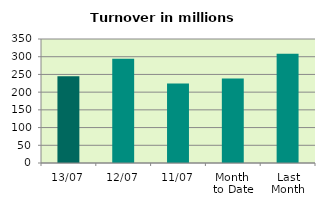
| Category | Series 0 |
|---|---|
| 13/07 | 244.578 |
| 12/07 | 294.517 |
| 11/07 | 224.48 |
| Month 
to Date | 238.482 |
| Last
Month | 308.534 |